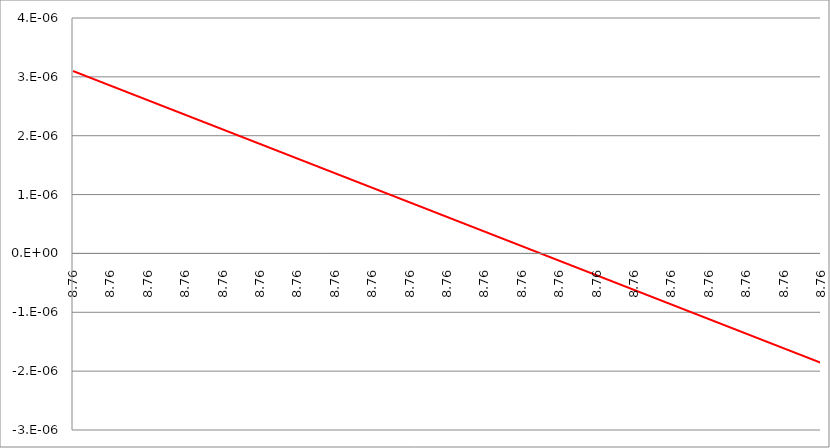
| Category | Series 1 | Series 0 | Series 2 |
|---|---|---|---|
| 8.76286429658 | 0 |  |  |
| 8.76286429658 | 0 |  |  |
| 8.762864296580004 | 0 |  |  |
| 8.762864296580005 | 0 |  |  |
| 8.762864296580007 | 0 |  |  |
| 8.762864296580007 | 0 |  |  |
| 8.76286429658001 | 0 |  |  |
| 8.76286429658001 | 0 |  |  |
| 8.762864296580014 | 0 |  |  |
| 8.762864296580016 | 0 |  |  |
| 8.762864296580018 | 0 |  |  |
| 8.76286429658002 | 0 |  |  |
| 8.76286429658002 | 0 |  |  |
| 8.762864296580023 | 0 |  |  |
| 8.762864296580023 | 0 |  |  |
| 8.762864296580027 | 0 |  |  |
| 8.762864296580029 | 0 |  |  |
| 8.76286429658003 | 0 |  |  |
| 8.76286429658003 | 0 |  |  |
| 8.762864296580034 | 0 |  |  |
| 8.762864296580036 | 0 |  |  |
| 8.762864296580037 | 0 |  |  |
| 8.76286429658004 | 0 |  |  |
| 8.76286429658004 | 0 |  |  |
| 8.76286429658004 | 0 |  |  |
| 8.762864296580045 | 0 |  |  |
| 8.762864296580046 | 0 |  |  |
| 8.762864296580046 | 0 |  |  |
| 8.76286429658005 | 0 |  |  |
| 8.76286429658005 | 0 |  |  |
| 8.762864296580053 | 0 |  |  |
| 8.762864296580055 | 0 |  |  |
| 8.762864296580055 | 0 |  |  |
| 8.762864296580059 | 0 |  |  |
| 8.76286429658006 | 0 |  |  |
| 8.76286429658006 | 0 |  |  |
| 8.762864296580062 | 0 |  |  |
| 8.762864296580066 | 0 |  |  |
| 8.762864296580068 | 0 |  |  |
| 8.76286429658007 | 0 |  |  |
| 8.76286429658007 | 0 |  |  |
| 8.762864296580071 | 0 |  |  |
| 8.762864296580075 | 0 |  |  |
| 8.762864296580076 | 0 |  |  |
| 8.762864296580078 | 0 |  |  |
| 8.76286429658008 | 0 |  |  |
| 8.76286429658008 | 0 |  |  |
| 8.762864296580084 | 0 |  |  |
| 8.762864296580085 | 0 |  |  |
| 8.762864296580087 | 0 |  |  |
| 8.762864296580087 | 0 |  |  |
| 8.76286429658009 | 0 |  |  |
| 8.76286429658009 | 0 |  |  |
| 8.762864296580094 | 0 |  |  |
| 8.762864296580094 | 0 |  |  |
| 8.762864296580098 | 0 |  |  |
| 8.7628642965801 | 0 |  |  |
| 8.7628642965801 | 0 |  |  |
| 8.762864296580103 | 0 |  |  |
| 8.762864296580103 | 0 |  |  |
| 8.762864296580107 | 0 |  |  |
| 8.762864296580108 | 0 |  |  |
| 8.76286429658011 | 0 |  |  |
| 8.76286429658011 | 0 |  |  |
| 8.762864296580114 | 0 |  |  |
| 8.762864296580116 | 0 |  |  |
| 8.762864296580117 | 0 |  |  |
| 8.76286429658012 | 0 |  |  |
| 8.76286429658012 | 0 |  |  |
| 8.762864296580123 | 0 |  |  |
| 8.762864296580124 | 0 |  |  |
| 8.762864296580126 | 0 |  |  |
| 8.762864296580126 | 0 |  |  |
| 8.76286429658013 | 0 |  |  |
| 8.76286429658013 | 0 |  |  |
| 8.762864296580133 | 0 |  |  |
| 8.762864296580135 | 0 |  |  |
| 8.762864296580137 | 0 |  |  |
| 8.762864296580139 | 0 |  |  |
| 8.76286429658014 | 0 |  |  |
| 8.76286429658014 | 0 |  |  |
| 8.762864296580142 | 0 |  |  |
| 8.762864296580146 | 0 |  |  |
| 8.762864296580148 | 0 |  |  |
| 8.76286429658015 | 0 |  |  |
| 8.76286429658015 | 0 |  |  |
| 8.762864296580153 | 0 |  |  |
| 8.762864296580155 | 0 |  |  |
| 8.762864296580156 | 0 |  |  |
| 8.762864296580158 | 0 |  |  |
| 8.76286429658016 | 0 |  |  |
| 8.76286429658016 | 0 |  |  |
| 8.762864296580164 | 0 |  |  |
| 8.762864296580165 | 0 |  |  |
| 8.762864296580165 | 0 |  |  |
| 8.762864296580169 | 0 |  |  |
| 8.76286429658017 | 0 |  |  |
| 8.762864296580172 | 0 |  |  |
| 8.762864296580174 | 0 |  |  |
| 8.762864296580174 | 0 |  |  |
| 8.762864296580178 | 0 |  |  |
| 8.76286429658018 | 0 |  |  |
| 8.76286429658018 | 0 |  |  |
| 8.762864296580181 | 0 |  |  |
| 8.762864296580185 | 0 |  |  |
| 8.762864296580187 | 0 |  |  |
| 8.762864296580188 | 0 |  |  |
| 8.76286429658019 | 0 |  |  |
| 8.76286429658019 | 0 |  |  |
| 8.762864296580194 | 0 |  |  |
| 8.762864296580196 | 0 |  |  |
| 8.762864296580197 | 0 |  |  |
| 8.762864296580197 | 0 |  |  |
| 8.7628642965802 | 0 |  |  |
| 8.7628642965802 | 0 |  |  |
| 8.762864296580204 | 0 |  |  |
| 8.762864296580206 | 0 |  |  |
| 8.762864296580206 | 0 |  |  |
| 8.76286429658021 | 0 |  |  |
| 8.76286429658021 | 0 |  |  |
| 8.76286429658021 | 0 |  |  |
| 8.762864296580213 | 0 |  |  |
| 8.762864296580217 | 0 |  |  |
| 8.762864296580219 | 0 |  |  |
| 8.76286429658022 | 0 |  |  |
| 8.76286429658022 | 0 |  |  |
| 8.762864296580222 | 0 |  |  |
| 8.762864296580226 | 0 |  |  |
| 8.762864296580227 | 0 |  |  |
| 8.76286429658023 | 0 |  |  |
| 8.76286429658023 | 0 |  |  |
| 8.76286429658023 | 0 |  |  |
| 8.762864296580235 | 0 |  |  |
| 8.762864296580236 | 0 |  |  |
| 8.762864296580238 | 0 |  |  |
| 8.76286429658024 | 0 |  |  |
| 8.76286429658024 | 0 |  |  |
| 8.76286429658024 | 0 |  |  |
| 8.762864296580245 | 0 |  |  |
| 8.762864296580245 | 0 |  |  |
| 8.762864296580249 | 0 |  |  |
| 8.76286429658025 | 0 |  |  |
| 8.76286429658025 | 0 |  |  |
| 8.762864296580254 | 0 |  |  |
| 8.762864296580254 | 0 |  |  |
| 8.762864296580258 | 0 |  |  |
| 8.76286429658026 | 0 |  |  |
| 8.76286429658026 | 0 |  |  |
| 8.76286429658026 | 0 |  |  |
| 8.762864296580265 | 0 |  |  |
| 8.762864296580267 | 0 |  |  |
| 8.762864296580268 | 0 |  |  |
| 8.76286429658027 | 0 |  |  |
| 8.76286429658027 | 0 |  |  |
| 8.762864296580274 | 0 |  |  |
| 8.762864296580275 | 0 |  |  |
| 8.762864296580277 | 0 |  |  |
| 8.762864296580277 | 0 |  |  |
| 8.76286429658028 | 0 |  |  |
| 8.76286429658028 | 0 |  |  |
| 8.762864296580284 | 0 |  |  |
| 8.762864296580286 | 0 |  |  |
| 8.762864296580288 | 0 |  |  |
| 8.76286429658029 | 0 |  |  |
| 8.76286429658029 | 0 |  |  |
| 8.76286429658029 | 0 |  |  |
| 8.762864296580293 | 0 |  |  |
| 8.762864296580297 | 0 |  |  |
| 8.762864296580299 | 0 |  |  |
| 8.7628642965803 | 0 |  |  |
| 8.7628642965803 | 0 |  |  |
| 8.762864296580304 | 0 |  |  |
| 8.762864296580306 | 0 |  |  |
| 8.762864296580307 | 0 |  |  |
| 8.76286429658031 | 0 |  |  |
| 8.76286429658031 | 0 |  |  |
| 8.76286429658031 | 0 |  |  |
| 8.762864296580315 | 0 |  |  |
| 8.762864296580316 | 0 |  |  |
| 8.762864296580316 | 0 |  |  |
| 8.76286429658032 | 0 |  |  |
| 8.76286429658032 | 0 |  |  |
| 8.762864296580323 | 0 |  |  |
| 8.762864296580325 | 0 |  |  |
| 8.762864296580325 | 0 |  |  |
| 8.762864296580329 | 0 |  |  |
| 8.76286429658033 | 0 |  |  |
| 8.76286429658033 | 0 |  |  |
| 8.762864296580332 | 0 |  |  |
| 8.762864296580336 | 0 |  |  |
| 8.762864296580338 | 0 |  |  |
| 8.76286429658034 | 0 |  |  |
| 8.76286429658034 | 0 |  |  |
| 8.76286429658034 | 0 |  |  |
| 8.762864296580345 | 0 |  |  |
| 8.762864296580346 | 0 |  |  |
| 8.762864296580348 | 0 |  |  |
| 8.76286429658035 | 0 |  |  |
| 8.76286429658035 | 0 |  |  |
| 8.762864296580354 | 0 |  |  |
| 8.762864296580355 | 0 |  |  |
| 8.762864296580357 | 0 |  |  |
| 8.762864296580357 | 0 |  |  |
| 8.76286429658036 | 0 |  |  |
| 8.76286429658036 | 0 |  |  |
| 8.762864296580364 | 0 |  |  |
| 8.762864296580364 | 0 |  |  |
| 8.762864296580368 | 0 |  |  |
| 8.76286429658037 | 0 |  |  |
| 8.76286429658037 | 0 |  |  |
| 8.762864296580373 | 0 |  |  |
| 8.762864296580373 | 0 |  |  |
| 8.762864296580377 | 0 |  |  |
| 8.762864296580378 | 0 |  |  |
| 8.76286429658038 | 0 |  |  |
| 8.76286429658038 | 0 |  |  |
| 8.762864296580384 | 0 |  |  |
| 8.762864296580386 | 0 |  |  |
| 8.762864296580387 | 0 |  |  |
| 8.76286429658039 | 0 |  |  |
| 8.76286429658039 | 0 |  |  |
| 8.76286429658039 | 0 |  |  |
| 8.762864296580394 | 0 |  |  |
| 8.762864296580396 | 0 |  |  |
| 8.762864296580396 | 0 |  |  |
| 8.7628642965804 | 0 |  |  |
| 8.7628642965804 | 0 |  |  |
| 8.762864296580403 | 0 |  |  |
| 8.762864296580405 | 0 |  |  |
| 8.762864296580407 | 0 |  |  |
| 8.762864296580409 | 0 |  |  |
| 8.76286429658041 | 0 |  |  |
| 8.76286429658041 | 0 |  |  |
| 8.762864296580412 | 0 |  |  |
| 8.762864296580416 | 0 |  |  |
| 8.762864296580418 | 0 |  |  |
| 8.76286429658042 | 0 |  |  |
| 8.76286429658042 | 0 |  |  |
| 8.762864296580423 | 0 |  |  |
| 8.762864296580425 | 0 |  |  |
| 8.762864296580426 | 0 |  |  |
| 8.762864296580428 | 0 |  |  |
| 8.76286429658043 | 0 |  |  |
| 8.76286429658043 | 0 |  |  |
| 8.762864296580434 | 0 |  |  |
| 8.762864296580435 | 0 |  |  |
| 8.762864296580437 | 0 |  |  |
| 8.762864296580439 | 0 |  |  |
| 8.76286429658044 | 0 |  |  |
| 8.76286429658044 | 0 |  |  |
| 8.762864296580444 | 0 |  |  |
| 8.762864296580444 | 0 |  |  |
| 8.762864296580448 | 0 |  |  |
| 8.76286429658045 | 0 |  |  |
| 8.76286429658045 | 0 |  |  |
| 8.762864296580451 | 0 |  |  |
| 8.762864296580455 | 0 |  |  |
| 8.762864296580457 | 0 |  |  |
| 8.762864296580458 | 0 |  |  |
| 8.76286429658046 | 0 |  |  |
| 8.76286429658046 | 0 |  |  |
| 8.762864296580464 | 0 |  |  |
| 8.762864296580466 | 0 |  |  |
| 8.762864296580467 | 0 |  |  |
| 8.762864296580467 | 0 |  |  |
| 8.76286429658047 | 0 |  |  |
| 8.762864296580473 | 0 |  |  |
| 8.762864296580474 | 0 |  |  |
| 8.762864296580476 | 0 |  |  |
| 8.762864296580476 | 0 |  |  |
| 8.76286429658048 | 0 |  |  |
| 8.76286429658048 | 0 |  |  |
| 8.762864296580483 | 0 |  |  |
| 8.762864296580483 | 0 |  |  |
| 8.762864296580487 | 0 |  |  |
| 8.762864296580489 | 0 |  |  |
| 8.76286429658049 | 0 |  |  |
| 8.76286429658049 | 0 |  |  |
| 8.762864296580492 | 0 |  |  |
| 8.762864296580496 | 0 |  |  |
| 8.762864296580497 | 0 |  |  |
| 8.7628642965805 | 0 |  |  |
| 8.7628642965805 | 0 |  |  |
| 8.762864296580503 | 0 |  |  |
| 8.762864296580505 | 0 |  |  |
| 8.762864296580506 | 0 |  |  |
| 8.762864296580508 | 0 |  |  |
| 8.76286429658051 | 0 |  |  |
| 8.76286429658051 | 0 |  |  |
| 8.762864296580513 | 0 |  |  |
| 8.762864296580515 | 0 |  |  |
| 8.762864296580515 | 0 |  |  |
| 8.762864296580519 | 0 |  |  |
| 8.76286429658052 | 0 |  |  |
| 8.762864296580522 | 0 |  |  |
| 8.762864296580524 | 0 |  |  |
| 8.762864296580524 | 0 |  |  |
| 8.762864296580528 | 0 |  |  |
| 8.76286429658053 | 0 |  |  |
| 8.76286429658053 | 0 |  |  |
| 8.762864296580531 | 0 |  |  |
| 8.762864296580535 | 0 |  |  |
| 8.762864296580537 | 0 |  |  |
| 8.762864296580538 | 0 |  |  |
| 8.76286429658054 | 0 |  |  |
| 8.76286429658054 | 0 |  |  |
| 8.762864296580544 | 0 |  |  |
| 8.762864296580545 | 0 |  |  |
| 8.762864296580547 | 0 |  |  |
| 8.762864296580547 | 0 |  |  |
| 8.76286429658055 | 0 |  |  |
| 8.762864296580553 | 0 |  |  |
| 8.762864296580554 | 0 |  |  |
| 8.762864296580556 | 0 |  |  |
| 8.762864296580558 | 0 |  |  |
| 8.76286429658056 | 0 |  |  |
| 8.76286429658056 | 0 |  |  |
| 8.762864296580563 | 0 |  |  |
| 8.762864296580563 | 0 |  |  |
| 8.762864296580567 | 0 |  |  |
| 8.762864296580569 | 0 |  |  |
| 8.76286429658057 | 0 |  |  |
| 8.762864296580572 | 0 |  |  |
| 8.762864296580574 | 0 |  |  |
| 8.762864296580576 | 0 |  |  |
| 8.762864296580577 | 0 |  |  |
| 8.76286429658058 | 0 |  |  |
| 8.76286429658058 | 0 |  |  |
| 8.762864296580583 | 0 |  |  |
| 8.762864296580585 | 0 |  |  |
| 8.762864296580586 | 0 |  |  |
| 8.762864296580586 | 0 |  |  |
| 8.76286429658059 | 0 |  |  |
| 8.76286429658059 | 0 |  |  |
| 8.762864296580593 | 0 |  |  |
| 8.762864296580595 | 0 |  |  |
| 8.762864296580595 | 0 |  |  |
| 8.762864296580599 | 0 |  |  |
| 8.7628642965806 | 0 |  |  |
| 8.7628642965806 | 0 |  |  |
| 8.762864296580602 | 0 |  |  |
| 8.762864296580606 | 0 |  |  |
| 8.762864296580608 | 0 |  |  |
| 8.76286429658061 | 0 |  |  |
| 8.76286429658061 | 0 |  |  |
| 8.76286429658061 | 0 |  |  |
| 8.762864296580615 | 0 |  |  |
| 8.762864296580616 | 0 |  |  |
| 8.762864296580618 | 0 |  |  |
| 8.76286429658062 | 0 |  |  |
| 8.76286429658062 | 0 |  |  |
| 8.762864296580624 | 0 |  |  |
| 8.762864296580625 | 0 |  |  |
| 8.762864296580627 | 0 |  |  |
| 8.762864296580627 | 0 |  |  |
| 8.76286429658063 | 0 |  |  |
| 8.76286429658063 | 0 |  |  |
| 8.762864296580634 | 0 |  |  |
| 8.762864296580634 | 0 |  |  |
| 8.762864296580638 | 0 |  |  |
| 8.76286429658064 | 0 |  |  |
| 8.76286429658064 | 0 |  |  |
| 8.76286429658064 | 0 |  |  |
| 8.762864296580643 | 0 |  |  |
| 8.762864296580647 | 0 |  |  |
| 8.762864296580648 | 0 |  |  |
| 8.76286429658065 | 0 |  |  |
| 8.76286429658065 | 0 |  |  |
| 8.762864296580654 | 0 |  |  |
| 8.762864296580656 | 0 |  |  |
| 8.762864296580657 | 0 |  |  |
| 8.76286429658066 | 0 |  |  |
| 8.76286429658066 | 0 |  |  |
| 8.76286429658066 | 0 |  |  |
| 8.762864296580664 | 0 |  |  |
| 8.762864296580666 | 0 |  |  |
| 8.762864296580666 | 0 |  |  |
| 8.76286429658067 | 0 |  |  |
| 8.76286429658067 | 0 |  |  |
| 8.762864296580673 | 0 |  |  |
| 8.762864296580675 | 0 |  |  |
| 8.762864296580675 | 0 |  |  |
| 8.762864296580679 | 0 |  |  |
| 8.76286429658068 | 0 |  |  |
| 8.76286429658068 | 0 |  |  |
| 8.762864296580682 | 0 |  |  |
| 8.762864296580686 | 0 |  |  |
| 8.762864296580688 | 0 |  |  |
| 8.76286429658069 | 0 |  |  |
| 8.76286429658069 | 0 |  |  |
| 8.76286429658069 | 0 |  |  |
| 8.762864296580695 | 0 |  |  |
| 8.762864296580696 | 0 |  |  |
| 8.762864296580698 | 0 |  |  |
| 8.7628642965807 | 0 |  |  |
| 8.7628642965807 | 0 |  |  |
| 8.762864296580704 | 0 |  |  |
| 8.762864296580705 | 0 |  |  |
| 8.762864296580707 | 0 |  |  |
| 8.762864296580709 | 0 |  |  |
| 8.76286429658071 | 0 |  |  |
| 8.76286429658071 | 0 |  |  |
| 8.762864296580714 | 0 |  |  |
| 8.762864296580714 | 0 |  |  |
| 8.762864296580718 | 0 |  |  |
| 8.76286429658072 | 0 |  |  |
| 8.76286429658072 | 0 |  |  |
| 8.762864296580721 | 0 |  |  |
| 8.762864296580725 | 0 |  |  |
| 8.762864296580727 | 0 |  |  |
| 8.762864296580728 | 0 |  |  |
| 8.76286429658073 | 0 |  |  |
| 8.76286429658073 | 0 |  |  |
| 8.762864296580734 | 0 |  |  |
| 8.762864296580736 | 0 |  |  |
| 8.762864296580737 | 0 |  |  |
| 8.762864296580737 | 0 |  |  |
| 8.76286429658074 | 0 |  |  |
| 8.76286429658074 | 0 |  |  |
| 8.762864296580744 | 0 |  |  |
| 8.762864296580746 | 0 |  |  |
| 8.762864296580746 | 0 |  |  |
| 8.76286429658075 | 0 |  |  |
| 8.76286429658075 | 0 |  |  |
| 8.762864296580753 | 0 |  |  |
| 8.762864296580753 | 0 |  |  |
| 8.762864296580757 | 0 |  |  |
| 8.762864296580759 | 0 |  |  |
| 8.76286429658076 | 0 |  |  |
| 8.76286429658076 | 0 |  |  |
| 8.762864296580762 | 0 |  |  |
| 8.762864296580766 | 0 |  |  |
| 8.762864296580767 | 0 |  |  |
| 8.76286429658077 | 0 |  |  |
| 8.76286429658077 | 0 |  |  |
| 8.762864296580773 | 0 |  |  |
| 8.762864296580775 | 0 |  |  |
| 8.762864296580776 | 0 |  |  |
| 8.762864296580778 | 0 |  |  |
| 8.76286429658078 | 0 |  |  |
| 8.76286429658078 | 0 |  |  |
| 8.762864296580783 | 0 |  |  |
| 8.762864296580785 | 0 |  |  |
| 8.762864296580785 | 0 |  |  |
| 8.762864296580789 | 0 |  |  |
| 8.76286429658079 | 0 |  |  |
| 8.76286429658079 | 0 |  |  |
| 8.762864296580794 | 0 |  |  |
| 8.762864296580794 | 0 |  |  |
| 8.762864296580798 | 0 |  |  |
| 8.7628642965808 | 0 |  |  |
| 8.7628642965808 | 0 |  |  |
| 8.762864296580801 | 0 |  |  |
| 8.762864296580805 | 0 |  |  |
| 8.762864296580807 | 0 |  |  |
| 8.762864296580808 | 0 |  |  |
| 8.76286429658081 | 0 |  |  |
| 8.76286429658081 | 0 |  |  |
| 8.762864296580814 | 0 |  |  |
| 8.762864296580815 | 0 |  |  |
| 8.762864296580817 | 0 |  |  |
| 8.762864296580817 | 0 |  |  |
| 8.76286429658082 | 0 |  |  |
| 8.762864296580823 | 0 |  |  |
| 8.762864296580824 | 0 |  |  |
| 8.762864296580826 | 0 |  |  |
| 8.762864296580828 | 0 |  |  |
| 8.76286429658083 | 0 |  |  |
| 8.76286429658083 | 0 |  |  |
| 8.762864296580833 | 0 |  |  |
| 8.762864296580833 | 0 |  |  |
| 8.762864296580837 | 0 |  |  |
| 8.762864296580839 | 0 |  |  |
| 8.76286429658084 | 0 |  |  |
| 8.76286429658084 | 0 |  |  |
| 8.762864296580844 | 0 |  |  |
| 8.762864296580846 | 0 |  |  |
| 8.762864296580847 | 0 |  |  |
| 8.76286429658085 | 0 |  |  |
| 8.76286429658085 | 0 |  |  |
| 8.762864296580853 | 0 |  |  |
| 8.762864296580855 | 0 |  |  |
| 8.762864296580856 | 0 |  |  |
| 8.762864296580858 | 0 |  |  |
| 8.76286429658086 | 0 |  |  |
| 8.76286429658086 | 0 |  |  |
| 8.762864296580863 | 0 |  |  |
| 8.762864296580865 | 0 |  |  |
| 8.762864296580865 | 0 |  |  |
| 8.762864296580869 | 0 |  |  |
| 8.76286429658087 | 0 |  |  |
| 8.762864296580872 | 0 |  |  |
| 8.762864296580872 | 0 |  |  |
| 8.762864296580876 | 0 |  |  |
| 8.762864296580878 | 0 |  |  |
| 8.76286429658088 | 0 |  |  |
| 8.76286429658088 | 0 |  |  |
| 8.762864296580881 | 0 |  |  |
| 8.762864296580885 | 0 |  |  |
| 8.762864296580887 | 0 |  |  |
| 8.762864296580888 | 0 |  |  |
| 8.76286429658089 | 0 |  |  |
| 8.76286429658089 | 0 |  |  |
| 8.762864296580894 | 0 |  |  |
| 8.762864296580895 | 0 |  |  |
| 8.762864296580897 | 0 |  |  |
| 8.762864296580897 | 0 |  |  |
| 8.7628642965809 | 0 |  |  |
| 8.7628642965809 | 0 |  |  |
| 8.762864296580904 | 0 |  |  |
| 8.762864296580904 | 0 |  |  |
| 8.762864296580908 | 0 |  |  |
| 8.76286429658091 | 0 |  |  |
| 8.76286429658091 | 0 |  |  |
| 8.76286429658091 | 0 |  |  |
| 8.762864296580913 | 0 |  |  |
| 8.762864296580917 | 0 |  |  |
| 8.762864296580918 | 0 |  |  |
| 8.76286429658092 | 0 |  |  |
| 8.76286429658092 | 0 |  |  |
| 8.762864296580924 | 0 |  |  |
| 8.762864296580926 | 0 |  |  |
| 8.762864296580927 | 0 |  |  |
| 8.76286429658093 | 0 |  |  |
| 8.76286429658093 | 0 |  |  |
| 8.76286429658093 | 0 |  |  |
| 8.762864296580934 | 0 |  |  |
| 8.762864296580936 | 0 |  |  |
| 8.762864296580936 | 0 |  |  |
| 8.76286429658094 | 0 |  |  |
| 8.76286429658094 | 0 |  |  |
| 8.76286429658094 | 0 |  |  |
| 8.762864296580945 | 0 |  |  |
| 8.762864296580945 | 0 |  |  |
| 8.762864296580949 | 0 |  |  |
| 8.76286429658095 | 0 |  |  |
| 8.76286429658095 | 0 |  |  |
| 8.762864296580952 | 0 |  |  |
| 8.762864296580956 | 0 |  |  |
| 8.762864296580958 | 0 |  |  |
| 8.76286429658096 | 0 |  |  |
| 8.76286429658096 | 0 |  |  |
| 8.76286429658096 | 0 |  |  |
| 8.762864296580965 | 0 |  |  |
| 8.762864296580966 | 0 |  |  |
| 8.762864296580968 | 0 |  |  |
| 8.76286429658097 | 0 |  |  |
| 8.76286429658097 | 0 |  |  |
| 8.762864296580974 | 0 |  |  |
| 8.762864296580975 | 0 |  |  |
| 8.762864296580977 | 0 |  |  |
| 8.762864296580979 | 0 |  |  |
| 8.76286429658098 | 0 |  |  |
| 8.76286429658098 | 0 |  |  |
| 8.762864296580984 | 0 |  |  |
| 8.762864296580984 | 0 |  |  |
| 8.762864296580988 | 0 |  |  |
| 8.76286429658099 | 0 |  |  |
| 8.76286429658099 | 0 |  |  |
| 8.76286429658099 | 0 |  |  |
| 8.762864296580995 | 0 |  |  |
| 8.762864296580997 | 0 |  |  |
| 8.762864296580998 | 0 |  |  |
| 8.762864296581 | 0 |  |  |
| 8.762864296581 | 0 |  |  |
| 8.762864296581004 | 0 |  |  |
| 8.762864296581006 | 0 |  |  |
| 8.762864296581007 | 0 |  |  |
| 8.762864296581007 | 0 |  |  |
| 8.76286429658101 | 0 |  |  |
| 8.76286429658101 | 0 |  |  |
| 8.762864296581014 | 0 |  |  |
| 8.762864296581016 | 0 |  |  |
| 8.762864296581016 | 0 |  |  |
| 8.76286429658102 | 0 |  |  |
| 8.76286429658102 | 0 |  |  |
| 8.762864296581023 | 0 |  |  |
| 8.762864296581023 | 0 |  |  |
| 8.762864296581027 | 0 |  |  |
| 8.762864296581029 | 0 |  |  |
| 8.76286429658103 | 0 |  |  |
| 8.76286429658103 | 0 |  |  |
| 8.762864296581032 | 0 |  |  |
| 8.762864296581036 | 0 |  |  |
| 8.762864296581037 | 0 |  |  |
| 8.76286429658104 | 0 |  |  |
| 8.76286429658104 | 0 |  |  |
| 8.76286429658104 | 0 |  |  |
| 8.762864296581045 | 0 |  |  |
| 8.762864296581046 | 0 |  |  |
| 8.762864296581048 | 0 |  |  |
| 8.76286429658105 | 0 |  |  |
| 8.76286429658105 | 0 |  |  |
| 8.762864296581053 | 0 |  |  |
| 8.762864296581055 | 0 |  |  |
| 8.762864296581055 | 0 |  |  |
| 8.762864296581059 | 0 |  |  |
| 8.76286429658106 | 0 |  |  |
| 8.76286429658106 | 0 |  |  |
| 8.762864296581064 | 0 |  |  |
| 8.762864296581064 | 0 |  |  |
| 8.762864296581068 | 0 |  |  |
| 8.76286429658107 | 0 |  |  |
| 8.76286429658107 | 0 |  |  |
| 8.762864296581071 | 0 |  |  |
| 8.762864296581075 | 0 |  |  |
| 8.762864296581077 | 0 |  |  |
| 8.762864296581078 | 0 |  |  |
| 8.76286429658108 | 0 |  |  |
| 8.76286429658108 | 0 |  |  |
| 8.762864296581084 | 0 |  |  |
| 8.762864296581085 | 0 |  |  |
| 8.762864296581087 | 0 |  |  |
| 8.762864296581087 | 0 |  |  |
| 8.76286429658109 | 0 |  |  |
| 8.76286429658109 | 0 |  |  |
| 8.762864296581094 | 0 |  |  |
| 8.762864296581096 | 0 |  |  |
| 8.762864296581096 | 0 |  |  |
| 8.7628642965811 | 0 |  |  |
| 8.7628642965811 | 0 |  |  |
| 8.762864296581103 | 0 |  |  |
| 8.762864296581103 | 0 |  |  |
| 8.762864296581107 | 0 |  |  |
| 8.762864296581109 | 0 |  |  |
| 8.76286429658111 | 0 |  |  |
| 8.76286429658111 | 0 |  |  |
| 8.762864296581114 | 0 |  |  |
| 8.762864296581116 | 0 |  |  |
| 8.762864296581117 | 0 |  |  |
| 8.76286429658112 | 0 |  |  |
| 8.76286429658112 | 0 |  |  |
| 8.762864296581123 | 0 |  |  |
| 8.762864296581125 | 0 |  |  |
| 8.762864296581126 | 0 |  |  |
| 8.762864296581128 | 0 |  |  |
| 8.76286429658113 | 0 |  |  |
| 8.76286429658113 | 0 |  |  |
| 8.762864296581133 | 0 |  |  |
| 8.762864296581135 | 0 |  |  |
| 8.762864296581135 | 0 |  |  |
| 8.762864296581139 | 0 |  |  |
| 8.76286429658114 | 0 |  |  |
| 8.76286429658114 | 0 |  |  |
| 8.762864296581142 | 0 |  |  |
| 8.762864296581146 | 0 |  |  |
| 8.762864296581148 | 0 |  |  |
| 8.76286429658115 | 0 |  |  |
| 8.76286429658115 | 0 |  |  |
| 8.762864296581151 | 0 |  |  |
| 8.762864296581155 | 0 |  |  |
| 8.762864296581157 | 0 |  |  |
| 8.762864296581158 | 0 |  |  |
| 8.76286429658116 | 0 |  |  |
| 8.76286429658116 | 0 |  |  |
| 8.762864296581164 | 0 |  |  |
| 8.762864296581165 | 0 |  |  |
| 8.762864296581167 | 0 |  |  |
| 8.762864296581167 | 0 |  |  |
| 8.76286429658117 | 0 |  |  |
| 8.762864296581172 | 0 |  |  |
| 8.762864296581174 | 0 |  |  |
| 8.762864296581174 | 0 |  |  |
| 8.762864296581178 | 0 |  |  |
| 8.76286429658118 | 0 |  |  |
| 8.76286429658118 | 0 |  |  |
| 8.762864296581183 | 0 |  |  |
| 8.762864296581183 | 0 |  |  |
| 8.762864296581187 | 0 |  |  |
| 8.762864296581188 | 0 |  |  |
| 8.76286429658119 | 0 |  |  |
| 8.76286429658119 | 0 |  |  |
| 8.762864296581194 | 0 |  |  |
| 8.762864296581196 | 0 |  |  |
| 8.762864296581197 | 0 |  |  |
| 8.7628642965812 | 0 |  |  |
| 8.7628642965812 | 0 |  |  |
| 8.7628642965812 | 0 |  |  |
| 8.762864296581204 | 0 |  |  |
| 8.762864296581206 | 0 |  |  |
| 8.762864296581206 | 0 |  |  |
| 8.76286429658121 | 0 |  |  |
| 8.76286429658121 | 0 |  |  |
| 8.76286429658121 | 0 |  |  |
| 8.762864296581215 | 0 |  |  |
| 8.762864296581215 | 0 |  |  |
| 8.762864296581219 | 0 |  |  |
| 8.76286429658122 | 0 |  |  |
| 8.76286429658122 | 0 |  |  |
| 8.762864296581222 | 0 |  |  |
| 8.762864296581226 | 0 |  |  |
| 8.762864296581228 | 0 |  |  |
| 8.76286429658123 | 0 |  |  |
| 8.76286429658123 | 0 |  |  |
| 8.76286429658123 | 0 |  |  |
| 8.762864296581235 | 0 |  |  |
| 8.762864296581236 | 0 |  |  |
| 8.762864296581238 | 0 |  |  |
| 8.76286429658124 | 0 |  |  |
| 8.76286429658124 | 0 |  |  |
| 8.76286429658124 | 0 |  |  |
| 8.762864296581245 | 0 |  |  |
| 8.762864296581247 | 0 |  |  |
| 8.762864296581249 | 0 |  |  |
| 8.76286429658125 | 0 |  |  |
| 8.76286429658125 | 0 |  |  |
| 8.762864296581254 | 0 |  |  |
| 8.762864296581254 | 0 |  |  |
| 8.762864296581258 | 0 |  |  |
| 8.76286429658126 | 0 |  |  |
| 8.76286429658126 | 0 |  |  |
| 8.76286429658126 | 0 |  |  |
| 8.762864296581265 | 0 |  |  |
| 8.762864296581267 | 0 |  |  |
| 8.762864296581268 | 0 |  |  |
| 8.76286429658127 | 0 |  |  |
| 8.76286429658127 | 0 |  |  |
| 8.762864296581274 | 0 |  |  |
| 8.762864296581276 | 0 |  |  |
| 8.762864296581277 | 0 |  |  |
| 8.762864296581277 | 0 |  |  |
| 8.76286429658128 | 0 |  |  |
| 8.76286429658128 | 0 |  |  |
| 8.762864296581284 | 0 |  |  |
| 8.762864296581286 | 0 |  |  |
| 8.762864296581286 | 0 |  |  |
| 8.76286429658129 | 0 |  |  |
| 8.76286429658129 | 0 |  |  |
| 8.76286429658129 | 0 |  |  |
| 8.762864296581293 | 0 |  |  |
| 8.762864296581297 | 0 |  |  |
| 8.762864296581299 | 0 |  |  |
| 8.7628642965813 | 0 |  |  |
| 8.7628642965813 | 0 |  |  |
| 8.762864296581302 | 0 |  |  |
| 8.762864296581306 | 0 |  |  |
| 8.762864296581307 | 0 |  |  |
| 8.76286429658131 | 0 |  |  |
| 8.76286429658131 | 0 |  |  |
| 8.76286429658131 | 0 |  |  |
| 8.762864296581315 | 0 |  |  |
| 8.762864296581316 | 0 |  |  |
| 8.762864296581318 | 0 |  |  |
| 8.76286429658132 | 0 |  |  |
| 8.76286429658132 | 0 |  |  |
| 8.762864296581323 | 0 |  |  |
| 8.762864296581325 | 0 |  |  |
| 8.762864296581325 | 0 |  |  |
| 8.762864296581329 | 0 |  |  |
| 8.76286429658133 | 0 |  |  |
| 8.76286429658133 | 0 |  |  |
| 8.762864296581334 | 0 |  |  |
| 8.762864296581334 | 0 |  |  |
| 8.762864296581338 | 0 |  |  |
| 8.76286429658134 | 0 |  |  |
| 8.76286429658134 | 0 |  |  |
| 8.76286429658134 | 0 |  |  |
| 8.762864296581345 | 0 |  |  |
| 8.762864296581347 | 0 |  |  |
| 8.762864296581348 | 0 |  |  |
| 8.76286429658135 | 0 |  |  |
| 8.76286429658135 | 0 |  |  |
| 8.762864296581354 | 0 |  |  |
| 8.762864296581355 | 0 |  |  |
| 8.762864296581357 | 0 |  |  |
| 8.762864296581357 | 0 |  |  |
| 8.76286429658136 | 0 |  |  |
| 8.76286429658136 | 0 |  |  |
| 8.762864296581364 | 0 |  |  |
| 8.762864296581366 | 0 |  |  |
| 8.762864296581366 | 0 |  |  |
| 8.76286429658137 | 0 |  |  |
| 8.76286429658137 | 0 |  |  |
| 8.762864296581373 | 0 |  |  |
| 8.762864296581373 | 0 |  |  |
| 8.762864296581377 | 0 |  |  |
| 8.762864296581379 | 0 |  |  |
| 8.76286429658138 | 0 |  |  |
| 8.76286429658138 | 0 |  |  |
| 8.762864296581384 | 0 |  |  |
| 8.762864296581386 | 0 |  |  |
| 8.762864296581387 | 0 |  |  |
| 8.76286429658139 | 0 |  |  |
| 8.76286429658139 | 0 |  |  |
| 8.76286429658139 | 0 |  |  |
| 8.762864296581395 | 0 |  |  |
| 8.762864296581396 | 0 |  |  |
| 8.762864296581398 | 0 |  |  |
| 8.7628642965814 | 0 |  |  |
| 8.7628642965814 | 0 |  |  |
| 8.762864296581403 | 0 |  |  |
| 8.762864296581405 | 0 |  |  |
| 8.762864296581405 | 0 |  |  |
| 8.762864296581409 | 0 |  |  |
| 8.76286429658141 | 0 |  |  |
| 8.76286429658141 | 0 |  |  |
| 8.762864296581414 | 0 |  |  |
| 8.762864296581416 | 0 |  |  |
| 8.762864296581418 | 0 |  |  |
| 8.76286429658142 | 0 |  |  |
| 8.76286429658142 | 0 |  |  |
| 8.762864296581421 | 0 |  |  |
| 8.762864296581425 | 0 |  |  |
| 8.762864296581427 | 0 |  |  |
| 8.762864296581428 | 0 |  |  |
| 8.76286429658143 | 0 |  |  |
| 8.76286429658143 | 0 |  |  |
| 8.762864296581434 | 0 |  |  |
| 8.762864296581435 | 0 |  |  |
| 8.762864296581437 | 0 |  |  |
| 8.762864296581437 | 0 |  |  |
| 8.76286429658144 | 0 |  |  |
| 8.76286429658144 | 0 |  |  |
| 8.762864296581444 | 0 |  |  |
| 8.762864296581444 | 0 |  |  |
| 8.762864296581448 | 0 |  |  |
| 8.76286429658145 | 0 |  |  |
| 8.76286429658145 | 0 |  |  |
| 8.762864296581453 | 0 |  |  |
| 8.762864296581453 | 0 |  |  |
| 8.762864296581457 | 0 |  |  |
| 8.762864296581458 | 0 |  |  |
| 8.76286429658146 | 0 |  |  |
| 8.76286429658146 | 0 |  |  |
| 8.762864296581464 | 0 |  |  |
| 8.762864296581466 | 0 |  |  |
| 8.762864296581467 | 0 |  |  |
| 8.76286429658147 | 0 |  |  |
| 8.76286429658147 | 0 |  |  |
| 8.762864296581473 | 0 |  |  |
| 8.762864296581474 | 0 |  |  |
| 8.762864296581476 | 0 |  |  |
| 8.762864296581476 | 0 |  |  |
| 8.76286429658148 | 0 |  |  |
| 8.76286429658148 | 0 |  |  |
| 8.762864296581483 | 0 |  |  |
| 8.762864296581485 | 0 |  |  |
| 8.762864296581485 | 0 |  |  |
| 8.762864296581489 | 0 |  |  |
| 8.76286429658149 | 0 |  |  |
| 8.76286429658149 | 0 |  |  |
| 8.762864296581492 | 0 |  |  |
| 8.762864296581496 | 0 |  |  |
| 8.762864296581498 | 0 |  |  |
| 8.7628642965815 | 0 |  |  |
| 8.7628642965815 | 0 |  |  |
| 8.762864296581501 | 0 |  |  |
| 8.762864296581505 | 0 |  |  |
| 8.762864296581506 | 0 |  |  |
| 8.762864296581508 | 0 |  |  |
| 8.76286429658151 | 0 |  |  |
| 8.76286429658151 | 0 |  |  |
| 8.762864296581514 | 0 |  |  |
| 8.762864296581515 | 0 |  |  |
| 8.762864296581517 | 0 |  |  |
| 8.762864296581519 | 0 |  |  |
| 8.76286429658152 | 0 |  |  |
| 8.762864296581522 | 0 |  |  |
| 8.762864296581524 | 0 |  |  |
| 8.762864296581524 | 0 |  |  |
| 8.762864296581528 | 0 |  |  |
| 8.76286429658153 | 0 |  |  |
| 8.76286429658153 | 0 |  |  |
| 8.762864296581533 | 0 |  |  |
| 8.762864296581535 | 0 |  |  |
| 8.762864296581537 | 0 |  |  |
| 8.762864296581538 | 0 |  |  |
| 8.76286429658154 | 0 |  |  |
| 8.76286429658154 | 0 |  |  |
| 8.762864296581544 | 0 |  |  |
| 8.762864296581546 | 0 |  |  |
| 8.762864296581547 | 0 |  |  |
| 8.76286429658155 | 0 |  |  |
| 8.76286429658155 | 0 |  |  |
| 8.762864296581553 | 0 |  |  |
| 8.762864296581554 | 0 |  |  |
| 8.762864296581556 | 0 |  |  |
| 8.762864296581556 | 0 |  |  |
| 8.76286429658156 | 0 |  |  |
| 8.76286429658156 | 0 |  |  |
| 8.762864296581563 | 0 |  |  |
| 8.762864296581563 | 0 |  |  |
| 8.762864296581567 | 0 |  |  |
| 8.762864296581569 | 0 |  |  |
| 8.76286429658157 | 0 |  |  |
| 8.762864296581572 | 0 |  |  |
| 8.762864296581572 | 0 |  |  |
| 8.762864296581576 | 0 |  |  |
| 8.762864296581578 | 0 |  |  |
| 8.76286429658158 | 0 |  |  |
| 8.76286429658158 | 0 |  |  |
| 8.762864296581583 | 0 |  |  |
| 8.762864296581585 | 0 |  |  |
| 8.762864296581586 | 0 |  |  |
| 8.762864296581588 | 0 |  |  |
| 8.76286429658159 | 0 |  |  |
| 8.76286429658159 | 0 |  |  |
| 8.762864296581593 | 0 |  |  |
| 8.762864296581595 | 0 |  |  |
| 8.762864296581595 | 0 |  |  |
| 8.762864296581599 | 0 |  |  |
| 8.7628642965816 | 0 |  |  |
| 8.7628642965816 | 0 |  |  |
| 8.762864296581604 | 0 |  |  |
| 8.762864296581604 | 0 |  |  |
| 8.762864296581608 | 0 |  |  |
| 8.76286429658161 | 0 |  |  |
| 8.76286429658161 | 0 |  |  |
| 8.76286429658161 | 0 |  |  |
| 8.762864296581615 | 0 |  |  |
| 8.762864296581617 | 0 |  |  |
| 8.762864296581618 | 0 |  |  |
| 8.76286429658162 | 0 |  |  |
| 8.76286429658162 | 0 |  |  |
| 8.762864296581624 | 0 |  |  |
| 8.762864296581625 | 0 |  |  |
| 8.762864296581627 | 0 |  |  |
| 8.762864296581627 | 0 |  |  |
| 8.76286429658163 | 0 |  |  |
| 8.76286429658163 | 0 |  |  |
| 8.762864296581634 | 0 |  |  |
| 8.762864296581636 | 0 |  |  |
| 8.762864296581636 | 0 |  |  |
| 8.76286429658164 | 0 |  |  |
| 8.76286429658164 | 0 |  |  |
| 8.76286429658164 | 0 |  |  |
| 8.762864296581643 | 0 |  |  |
| 8.762864296581647 | 0 |  |  |
| 8.762864296581649 | 0 |  |  |
| 8.76286429658165 | 0 |  |  |
| 8.76286429658165 | 0 |  |  |
| 8.762864296581652 | 0 |  |  |
| 8.762864296581656 | 0 |  |  |
| 8.762864296581657 | 0 |  |  |
| 8.76286429658166 | 0 |  |  |
| 8.76286429658166 | 0 |  |  |
| 8.76286429658166 | 0 |  |  |
| 8.762864296581665 | 0 |  |  |
| 8.762864296581666 | 0 |  |  |
| 8.762864296581668 | 0 |  |  |
| 8.76286429658167 | 0 |  |  |
| 8.76286429658167 | 0 |  |  |
| 8.762864296581673 | 0 |  |  |
| 8.762864296581675 | 0 |  |  |
| 8.762864296581675 | 0 |  |  |
| 8.762864296581679 | 0 |  |  |
| 8.76286429658168 | 0 |  |  |
| 8.76286429658168 | 0 |  |  |
| 8.762864296581684 | 0 |  |  |
| 8.762864296581686 | 0 |  |  |
| 8.762864296581688 | 0 |  |  |
| 8.76286429658169 | 0 |  |  |
| 8.76286429658169 | 0 |  |  |
| 8.76286429658169 | 0 |  |  |
| 8.762864296581695 | 0 |  |  |
| 8.762864296581697 | 0 |  |  |
| 8.762864296581698 | 0 |  |  |
| 8.7628642965817 | 0 |  |  |
| 8.7628642965817 | 0 |  |  |
| 8.762864296581704 | 0 |  |  |
| 8.762864296581705 | 0 |  |  |
| 8.762864296581707 | 0 |  |  |
| 8.762864296581707 | 0 |  |  |
| 8.76286429658171 | 0 |  |  |
| 8.76286429658171 | 0 |  |  |
| 8.762864296581714 | 0 |  |  |
| 8.762864296581714 | 0 |  |  |
| 8.762864296581718 | 0 |  |  |
| 8.76286429658172 | 0 |  |  |
| 8.76286429658172 | 0 |  |  |
| 8.762864296581723 | 0 |  |  |
| 8.762864296581723 | 0 |  |  |
| 8.762864296581727 | 0 |  |  |
| 8.762864296581728 | 0 |  |  |
| 8.76286429658173 | 0 |  |  |
| 8.76286429658173 | 0 |  |  |
| 8.762864296581734 | 0 |  |  |
| 8.762864296581736 | 0 |  |  |
| 8.762864296581737 | 0 |  |  |
| 8.76286429658174 | 0 |  |  |
| 8.76286429658174 | 0 |  |  |
| 8.76286429658174 | 0 |  |  |
| 8.762864296581744 | 0 |  |  |
| 8.762864296581746 | 0 |  |  |
| 8.762864296581746 | 0 |  |  |
| 8.76286429658175 | 0 |  |  |
| 8.76286429658175 | 0 |  |  |
| 8.762864296581753 | 0 |  |  |
| 8.762864296581755 | 0 |  |  |
| 8.762864296581755 | 0 |  |  |
| 8.762864296581759 | 0 |  |  |
| 8.76286429658176 | 0 |  |  |
| 8.76286429658176 | 0 |  |  |
| 8.762864296581762 | 0 |  |  |
| 8.762864296581766 | 0 |  |  |
| 8.762864296581768 | 0 |  |  |
| 8.76286429658177 | 0 |  |  |
| 8.76286429658177 | 0 |  |  |
| 8.762864296581771 | 0 |  |  |
| 8.762864296581775 | 0 |  |  |
| 8.762864296581776 | 0 |  |  |
| 8.762864296581778 | 0 |  |  |
| 8.76286429658178 | 0 |  |  |
| 8.76286429658178 | 0 |  |  |
| 8.762864296581784 | 0 |  |  |
| 8.762864296581785 | 0 |  |  |
| 8.762864296581787 | 0 |  |  |
| 8.762864296581787 | 0 |  |  |
| 8.76286429658179 | 0 |  |  |
| 8.76286429658179 | 0 |  |  |
| 8.762864296581794 | 0 |  |  |
| 8.762864296581794 | 0 |  |  |
| 8.762864296581798 | 0 |  |  |
| 8.7628642965818 | 0 |  |  |
| 8.7628642965818 | 0 |  |  |
| 8.762864296581803 | 0 |  |  |
| 8.762864296581805 | 0 |  |  |
| 8.762864296581807 | 0 |  |  |
| 8.762864296581808 | 0 |  |  |
| 8.76286429658181 | 0 |  |  |
| 8.76286429658181 | 0 |  |  |
| 8.762864296581814 | 0 |  |  |
| 8.762864296581816 | 0 |  |  |
| 8.762864296581817 | 0 |  |  |
| 8.76286429658182 | 0 |  |  |
| 8.76286429658182 | 0 |  |  |
| 8.762864296581823 | 0 |  |  |
| 8.762864296581824 | 0 |  |  |
| 8.762864296581826 | 0 |  |  |
| 8.762864296581826 | 0 |  |  |
| 8.76286429658183 | 0 |  |  |
| 8.76286429658183 | 0 |  |  |
| 8.762864296581833 | 0 |  |  |
| 8.762864296581833 | 0 |  |  |
| 8.762864296581837 | 0 |  |  |
| 8.762864296581839 | 0 |  |  |
| 8.76286429658184 | 0 |  |  |
| 8.76286429658184 | 0 |  |  |
| 8.762864296581842 | 0 |  |  |
| 8.762864296581846 | 0 |  |  |
| 8.762864296581848 | 0 |  |  |
| 8.76286429658185 | 0 |  |  |
| 8.76286429658185 | 0 |  |  |
| 8.762864296581853 | 0 |  |  |
| 8.762864296581855 | 0 |  |  |
| 8.762864296581856 | 0 |  |  |
| 8.762864296581858 | 0 |  |  |
| 8.76286429658186 | 0 |  |  |
| 8.76286429658186 | 0 |  |  |
| 8.762864296581863 | 0 |  |  |
| 8.762864296581865 | 0 |  |  |
| 8.762864296581865 | 0 |  |  |
| 8.762864296581869 | 0 |  |  |
| 8.76286429658187 | 0 |  |  |
| 8.762864296581872 | 0 |  |  |
| 8.762864296581874 | 0 |  |  |
| 8.762864296581874 | 0 |  |  |
| 8.762864296581878 | 0 |  |  |
| 8.76286429658188 | 0 |  |  |
| 8.76286429658188 | 0 |  |  |
| 8.762864296581881 | 0 |  |  |
| 8.762864296581885 | 0 |  |  |
| 8.762864296581887 | 0 |  |  |
| 8.762864296581888 | 0 |  |  |
| 8.76286429658189 | 0 |  |  |
| 8.76286429658189 | 0 |  |  |
| 8.762864296581894 | 0 |  |  |
| 8.762864296581895 | 0 |  |  |
| 8.762864296581897 | 0 |  |  |
| 8.762864296581897 | 0 |  |  |
| 8.7628642965819 | 0 |  |  |
| 8.7628642965819 | 0 |  |  |
| 8.762864296581904 | 0 |  |  |
| 8.762864296581906 | 0 |  |  |
| 8.762864296581906 | 0 |  |  |
| 8.76286429658191 | 0 |  |  |
| 8.76286429658191 | 0 |  |  |
| 8.76286429658191 | 0 |  |  |
| 8.762864296581913 | 0 |  |  |
| 8.762864296581917 | 0 |  |  |
| 8.762864296581919 | 0 |  |  |
| 8.76286429658192 | 0 |  |  |
| 8.76286429658192 | 0 |  |  |
| 8.762864296581922 | 0 |  |  |
| 8.762864296581926 | 0 |  |  |
| 8.762864296581927 | 0 |  |  |
| 8.76286429658193 | 0 |  |  |
| 8.76286429658193 | 0 |  |  |
| 8.76286429658193 | 0 |  |  |
| 8.762864296581935 | 0 |  |  |
| 8.762864296581936 | 0 |  |  |
| 8.762864296581938 | 0 |  |  |
| 8.76286429658194 | 0 |  |  |
| 8.76286429658194 | 0 |  |  |
| 8.76286429658194 | 0 |  |  |
| 8.762864296581945 | 0 |  |  |
| 8.762864296581945 | 0 |  |  |
| 8.762864296581949 | 0 |  |  |
| 8.76286429658195 | 0 |  |  |
| 8.76286429658195 | 0 |  |  |
| 8.762864296581954 | 0 |  |  |
| 8.762864296581956 | 0 |  |  |
| 8.762864296581958 | 0 |  |  |
| 8.76286429658196 | 0 |  |  |
| 8.76286429658196 | 0 |  |  |
| 8.76286429658196 | 0 |  |  |
| 8.762864296581965 | 0 |  |  |
| 8.762864296581967 | 0 |  |  |
| 8.762864296581968 | 0 |  |  |
| 8.76286429658197 | 0 |  |  |
| 8.76286429658197 | 0 |  |  |
| 8.762864296581974 | 0 |  |  |
| 8.762864296581975 | 0 |  |  |
| 8.762864296581977 | 0 |  |  |
| 8.762864296581977 | 0 |  |  |
| 8.76286429658198 | 0 |  |  |
| 8.76286429658198 | 0 |  |  |
| 8.762864296581984 | 0 |  |  |
| 8.762864296581984 | 0 |  |  |
| 8.762864296581988 | 0 |  |  |
| 8.76286429658199 | 0 |  |  |
| 8.76286429658199 | 0 |  |  |
| 8.76286429658199 | 0 |  |  |
| 8.762864296581993 | 0 |  |  |
| 8.762864296581997 | 0 |  |  |
| 8.762864296581999 | 0 |  |  |
| 8.762864296582 | 0 |  |  |
| 8.762864296582 | 0 |  |  |
| 8.762864296582004 | 0 |  |  |
| 8.762864296582006 | 0 |  |  |
| 8.762864296582007 | 0 |  |  |
| 8.76286429658201 | 0 |  |  |
| 8.76286429658201 | 0 |  |  |
| 8.76286429658201 | 0 |  |  |
| 8.762864296582014 | 0 |  |  |
| 8.762864296582016 | 0 |  |  |
| 8.762864296582016 | 0 |  |  |
| 8.76286429658202 | 0 |  |  |
| 8.76286429658202 | 0 |  |  |
| 8.762864296582023 | 0 |  |  |
| 8.762864296582025 | 0 |  |  |
| 8.762864296582025 | 0 |  |  |
| 8.762864296582029 | 0 |  |  |
| 8.76286429658203 | 0 |  |  |
| 8.76286429658203 | 0 |  |  |
| 8.762864296582032 | 0 |  |  |
| 8.762864296582036 | 0 |  |  |
| 8.762864296582038 | 0 |  |  |
| 8.76286429658204 | 0 |  |  |
| 8.76286429658204 | 0 |  |  |
| 8.76286429658204 | 0 |  |  |
| 8.762864296582045 | 0 |  |  |
| 8.762864296582046 | 0 |  |  |
| 8.762864296582048 | 0 |  |  |
| 8.76286429658205 | 0 |  |  |
| 8.76286429658205 | 0 |  |  |
| 8.762864296582054 | 0 |  |  |
| 8.762864296582055 | 0 |  |  |
| 8.762864296582057 | 0 |  |  |
| 8.762864296582057 | 0 |  |  |
| 8.76286429658206 | 0 |  |  |
| 8.76286429658206 | 0 |  |  |
| 8.762864296582064 | 0 |  |  |
| 8.762864296582064 | 0 |  |  |
| 8.762864296582068 | 0 |  |  |
| 8.76286429658207 | 0 |  |  |
| 8.76286429658207 | 0 |  |  |
| 8.762864296582073 | 0 |  |  |
| 8.762864296582075 | 0 |  |  |
| 8.762864296582077 | 0 |  |  |
| 8.762864296582078 | 0 |  |  |
| 8.76286429658208 | 0 |  |  |
| 8.76286429658208 | 0 |  |  |
| 8.762864296582084 | 0 |  |  |
| 8.762864296582086 | 0 |  |  |
| 8.762864296582087 | 0 |  |  |
| 8.76286429658209 | 0 |  |  |
| 8.76286429658209 | 0 |  |  |
| 8.76286429658209 | 0 |  |  |
| 8.762864296582094 | 0 |  |  |
| 8.762864296582096 | 0 |  |  |
| 8.762864296582096 | 0 |  |  |
| 8.7628642965821 | 0 |  |  |
| 8.7628642965821 | 0 |  |  |
| 8.762864296582103 | 0 |  |  |
| 8.762864296582105 | 0 |  |  |
| 8.762864296582107 | 0 |  |  |
| 8.762864296582109 | 0 |  |  |
| 8.76286429658211 | 0 |  |  |
| 8.76286429658211 | 0 |  |  |
| 8.762864296582112 | 0 |  |  |
| 8.762864296582116 | 0 |  |  |
| 8.762864296582118 | 0 |  |  |
| 8.76286429658212 | 0 |  |  |
| 8.76286429658212 | 0 |  |  |
| 8.762864296582123 | 0 |  |  |
| 8.762864296582125 | 0 |  |  |
| 8.762864296582126 | 0 |  |  |
| 8.762864296582128 | 0 |  |  |
| 8.76286429658213 | 0 |  |  |
| 8.76286429658213 | 0 |  |  |
| 8.762864296582134 | 0 |  |  |
| 8.762864296582135 | 0 |  |  |
| 8.762864296582135 | 0 |  |  |
| 8.762864296582139 | 0 |  |  |
| 8.76286429658214 | 0 |  |  |
| 8.76286429658214 | 0 |  |  |
| 8.762864296582144 | 0 |  |  |
| 8.762864296582144 | 0 |  |  |
| 8.762864296582148 | 0 |  |  |
| 8.76286429658215 | 0 |  |  |
| 8.76286429658215 | 0 |  |  |
| 8.762864296582151 | 0 |  |  |
| 8.762864296582155 | 0 |  |  |
| 8.762864296582157 | 0 |  |  |
| 8.762864296582158 | 0 |  |  |
| 8.76286429658216 | 0 |  |  |
| 8.76286429658216 | 0 |  |  |
| 8.762864296582164 | 0 |  |  |
| 8.762864296582165 | 0 |  |  |
| 8.762864296582167 | 0 |  |  |
| 8.762864296582167 | 0 |  |  |
| 8.76286429658217 | 0 |  |  |
| 8.762864296582173 | 0 |  |  |
| 8.762864296582174 | 0 |  |  |
| 8.762864296582176 | 0 |  |  |
| 8.762864296582176 | 0 |  |  |
| 8.76286429658218 | 0 |  |  |
| 8.76286429658218 | 0 |  |  |
| 8.762864296582183 | 0 |  |  |
| 8.762864296582183 | 0 |  |  |
| 8.762864296582187 | 0 |  |  |
| 8.762864296582189 | 0 |  |  |
| 8.76286429658219 | 0 |  |  |
| 8.76286429658219 | 0 |  |  |
| 8.762864296582192 | 0 |  |  |
| 8.762864296582196 | 0 |  |  |
| 8.762864296582197 | 0 |  |  |
| 8.7628642965822 | 0 |  |  |
| 8.7628642965822 | 0 |  |  |
| 8.7628642965822 | 0 |  |  |
| 8.762864296582205 | 0 |  |  |
| 8.762864296582206 | 0 |  |  |
| 8.762864296582208 | 0 |  |  |
| 8.76286429658221 | 0 |  |  |
| 8.76286429658221 | 0 |  |  |
| 8.76286429658221 | 0 |  |  |
| 8.762864296582215 | 0 |  |  |
| 8.762864296582215 | 0 |  |  |
| 8.762864296582219 | 0 |  |  |
| 8.76286429658222 | 0 |  |  |
| 8.76286429658222 | 0 |  |  |
| 8.762864296582224 | 0 |  |  |
| 8.762864296582226 | 0 |  |  |
| 8.762864296582228 | 0 |  |  |
| 8.76286429658223 | 0 |  |  |
| 8.76286429658223 | 0 |  |  |
| 8.76286429658223 | 0 |  |  |
| 8.762864296582235 | 0 |  |  |
| 8.762864296582237 | 0 |  |  |
| 8.762864296582238 | 0 |  |  |
| 8.76286429658224 | 0 |  |  |
| 8.76286429658224 | 0 |  |  |
| 8.76286429658224 | 0 |  |  |
| 8.762864296582245 | 0 |  |  |
| 8.762864296582247 | 0 |  |  |
| 8.762864296582247 | 0 |  |  |
| 8.76286429658225 | 0 |  |  |
| 8.76286429658225 | 0 |  |  |
| 8.762864296582254 | 0 |  |  |
| 8.762864296582254 | 0 |  |  |
| 8.762864296582258 | 0 |  |  |
| 8.76286429658226 | 0 |  |  |
| 8.76286429658226 | 0 |  |  |
| 8.76286429658226 | 0 |  |  |
| 8.762864296582263 | 0 |  |  |
| 8.762864296582267 | 0 |  |  |
| 8.762864296582269 | 0 |  |  |
| 8.76286429658227 | 0 |  |  |
| 8.76286429658227 | 0 |  |  |
| 8.762864296582274 | 0 |  |  |
| 8.762864296582276 | 0 |  |  |
| 8.762864296582277 | 0 |  |  |
| 8.76286429658228 | 0 |  |  |
| 8.76286429658228 | 0 |  |  |
| 8.76286429658228 | 0 |  |  |
| 8.762864296582284 | 0 |  |  |
| 8.762864296582286 | 0 |  |  |
| 8.762864296582286 | 0 |  |  |
| 8.76286429658229 | 0 |  |  |
| 8.76286429658229 | 0 |  |  |
| 8.76286429658229 | 0 |  |  |
| 8.762864296582295 | 0 |  |  |
| 8.762864296582295 | 0 |  |  |
| 8.762864296582299 | 0 |  |  |
| 8.7628642965823 | 0 |  |  |
| 8.7628642965823 | 0 |  |  |
| 8.762864296582302 | 0 |  |  |
| 8.762864296582306 | 0 |  |  |
| 8.762864296582308 | 0 |  |  |
| 8.76286429658231 | 0 |  |  |
| 8.76286429658231 | 0 |  |  |
| 8.76286429658231 | 0 |  |  |
| 8.762864296582315 | 0 |  |  |
| 8.762864296582316 | 0 |  |  |
| 8.762864296582318 | 0 |  |  |
| 8.76286429658232 | 0 |  |  |
| 8.76286429658232 | 0 |  |  |
| 8.762864296582324 | 0 |  |  |
| 8.762864296582325 | 0 |  |  |
| 8.762864296582327 | 0 |  |  |
| 8.762864296582327 | 0 |  |  |
| 8.76286429658233 | 0 |  |  |
| 8.76286429658233 | 0 |  |  |
| 8.762864296582334 | 0 |  |  |
| 8.762864296582334 | 0 |  |  |
| 8.762864296582338 | 0 |  |  |
| 8.76286429658234 | 0 |  |  |
| 8.76286429658234 | 0 |  |  |
| 8.76286429658234 | 0 |  |  |
| 8.762864296582343 | 0 |  |  |
| 8.762864296582347 | 0 |  |  |
| 8.762864296582348 | 0 |  |  |
| 8.76286429658235 | 0 |  |  |
| 8.76286429658235 | 0 |  |  |
| 8.762864296582354 | 0 |  |  |
| 8.762864296582356 | 0 |  |  |
| 8.762864296582357 | 0 |  |  |
| 8.76286429658236 | 0 |  |  |
| 8.76286429658236 | 0 |  |  |
| 8.76286429658236 | 0 |  |  |
| 8.762864296582364 | 0 |  |  |
| 8.762864296582366 | 0 |  |  |
| 8.762864296582366 | 0 |  |  |
| 8.76286429658237 | 0 |  |  |
| 8.76286429658237 | 0 |  |  |
| 8.762864296582373 | 0 |  |  |
| 8.762864296582375 | 0 |  |  |
| 8.762864296582377 | 0 |  |  |
| 8.762864296582379 | 0 |  |  |
| 8.76286429658238 | 0 |  |  |
| 8.76286429658238 | 0 |  |  |
| 8.762864296582382 | 0 |  |  |
| 8.762864296582386 | 0 |  |  |
| 8.762864296582388 | 0 |  |  |
| 8.76286429658239 | 0 |  |  |
| 8.76286429658239 | 0 |  |  |
| 8.76286429658239 | 0 |  |  |
| 8.762864296582395 | 0 |  |  |
| 8.762864296582396 | 0 |  |  |
| 8.762864296582398 | 0 |  |  |
| 8.7628642965824 | 0 |  |  |
| 8.7628642965824 | 0 |  |  |
| 8.762864296582404 | 0 |  |  |
| 8.762864296582405 | 0 |  |  |
| 8.762864296582405 | 0 |  |  |
| 8.762864296582409 | 0 |  |  |
| 8.76286429658241 | 0 |  |  |
| 8.76286429658241 | 0 |  |  |
| 8.762864296582414 | 0 |  |  |
| 8.762864296582414 | 0 |  |  |
| 8.762864296582418 | 0 |  |  |
| 8.76286429658242 | 0 |  |  |
| 8.76286429658242 | 0 |  |  |
| 8.762864296582421 | 0 |  |  |
| 8.762864296582425 | 0 |  |  |
| 8.762864296582427 | 0 |  |  |
| 8.762864296582428 | 0 |  |  |
| 8.76286429658243 | 0 |  |  |
| 8.76286429658243 | 0 |  |  |
| 8.762864296582434 | 0 |  |  |
| 8.762864296582435 | 0 |  |  |
| 8.762864296582437 | 0 |  |  |
| 8.762864296582437 | 0 |  |  |
| 8.76286429658244 | 0 |  |  |
| 8.76286429658244 | 0 |  |  |
| 8.762864296582444 | 0 |  |  |
| 8.762864296582446 | 0 |  |  |
| 8.762864296582446 | 0 |  |  |
| 8.76286429658245 | 0 |  |  |
| 8.76286429658245 | 0 |  |  |
| 8.762864296582453 | 0 |  |  |
| 8.762864296582453 | 0 |  |  |
| 8.762864296582457 | 0 |  |  |
| 8.762864296582459 | 0 |  |  |
| 8.76286429658246 | 0 |  |  |
| 8.76286429658246 | 0 |  |  |
| 8.762864296582462 | 0 |  |  |
| 8.762864296582466 | 0 |  |  |
| 8.762864296582467 | 0 |  |  |
| 8.76286429658247 | 0 |  |  |
| 8.76286429658247 | 0 |  |  |
| 8.762864296582473 | 0 |  |  |
| 8.762864296582475 | 0 |  |  |
| 8.762864296582476 | 0 |  |  |
| 8.762864296582478 | 0 |  |  |
| 8.76286429658248 | 0 |  |  |
| 8.76286429658248 | 0 |  |  |
| 8.762864296582483 | 0 |  |  |
| 8.762864296582485 | 0 |  |  |
| 8.762864296582485 | 0 |  |  |
| 8.762864296582489 | 0 |  |  |
| 8.76286429658249 | 0 |  |  |
| 8.76286429658249 | 0 |  |  |
| 8.762864296582494 | 0 |  |  |
| 8.762864296582496 | 0 |  |  |
| 8.762864296582498 | 0 |  |  |
| 8.7628642965825 | 0 |  |  |
| 8.7628642965825 | 0 |  |  |
| 8.762864296582501 | 0 |  |  |
| 8.762864296582505 | 0 |  |  |
| 8.762864296582507 | 0 |  |  |
| 8.762864296582508 | 0 |  |  |
| 8.76286429658251 | 0 |  |  |
| 8.76286429658251 | 0 |  |  |
| 8.762864296582514 | 0 |  |  |
| 8.762864296582515 | 0 |  |  |
| 8.762864296582517 | 0 |  |  |
| 8.762864296582517 | 0 |  |  |
| 8.76286429658252 | 0 |  |  |
| 8.762864296582523 | 0 |  |  |
| 8.762864296582524 | 0 |  |  |
| 8.762864296582526 | 0 |  |  |
| 8.762864296582528 | 0 |  |  |
| 8.76286429658253 | 0 |  |  |
| 8.76286429658253 | 0 |  |  |
| 8.762864296582533 | 0 |  |  |
| 8.762864296582533 | 0 |  |  |
| 8.762864296582537 | 0 |  |  |
| 8.762864296582539 | 0 |  |  |
| 8.76286429658254 | 0 |  |  |
| 8.76286429658254 | 0 |  |  |
| 8.762864296582544 | 0 |  |  |
| 8.762864296582546 | 0 |  |  |
| 8.762864296582547 | 0 |  |  |
| 8.76286429658255 | 0 |  |  |
| 8.76286429658255 | 0 |  |  |
| 8.762864296582553 | 0 |  |  |
| 8.762864296582555 | 0 |  |  |
| 8.762864296582556 | 0 |  |  |
| 8.762864296582556 | 0 |  |  |
| 8.76286429658256 | 0 |  |  |
| 8.76286429658256 | 0 |  |  |
| 8.762864296582563 | 0 |  |  |
| 8.762864296582565 | 0 |  |  |
| 8.762864296582565 | 0 |  |  |
| 8.762864296582569 | 0 |  |  |
| 8.76286429658257 | 0 |  |  |
| 8.762864296582572 | 0 |  |  |
| 8.762864296582572 | 0 |  |  |
| 8.762864296582576 | 0 |  |  |
| 8.762864296582578 | 0 |  |  |
| 8.76286429658258 | 0 |  |  |
| 8.76286429658258 | 0 |  |  |
| 8.762864296582581 | 0 |  |  |
| 8.762864296582585 | 0 |  |  |
| 8.762864296582586 | 0 |  |  |
| 8.762864296582588 | 0 |  |  |
| 8.76286429658259 | 0 |  |  |
| 8.76286429658259 | 0 |  |  |
| 8.762864296582594 | 0 |  |  |
| 8.762864296582595 | 0 |  |  |
| 8.762864296582597 | 0 |  |  |
| 8.762864296582597 | 0 |  |  |
| 8.7628642965826 | 0 |  |  |
| 8.7628642965826 | 0 |  |  |
| 8.762864296582604 | 0 |  |  |
| 8.762864296582604 | 0 |  |  |
| 8.762864296582608 | 0 |  |  |
| 8.76286429658261 | 0 |  |  |
| 8.76286429658261 | 0 |  |  |
| 8.76286429658261 | 0 |  |  |
| 8.762864296582613 | 0 |  |  |
| 8.762864296582617 | 0 |  |  |
| 8.762864296582618 | 0 |  |  |
| 8.76286429658262 | 0 |  |  |
| 8.76286429658262 | 0 |  |  |
| 8.762864296582624 | 0 |  |  |
| 8.762864296582626 | 0 |  |  |
| 8.762864296582627 | 0 |  |  |
| 8.76286429658263 | 0 |  |  |
| 8.76286429658263 | 0 |  |  |
| 8.76286429658263 | 0 |  |  |
| 8.762864296582634 | 0 |  |  |
| 8.762864296582636 | 0 |  |  |
| 8.762864296582636 | 0 |  |  |
| 8.76286429658264 | 0 |  |  |
| 8.76286429658264 | 0 |  |  |
| 8.76286429658264 | 0 |  |  |
| 8.762864296582645 | 0 |  |  |
| 8.762864296582647 | 0 |  |  |
| 8.762864296582649 | 0 |  |  |
| 8.76286429658265 | 0 |  |  |
| 8.76286429658265 | 0 |  |  |
| 8.762864296582652 | 0 |  |  |
| 8.762864296582656 | 0 |  |  |
| 8.762864296582658 | 0 |  |  |
| 8.76286429658266 | 0 |  |  |
| 8.76286429658266 | 0 |  |  |
| 8.76286429658266 | 0 |  |  |
| 8.762864296582665 | 0 |  |  |
| 8.762864296582666 | 0 |  |  |
| 8.762864296582668 | 0 |  |  |
| 8.76286429658267 | 0 |  |  |
| 8.76286429658267 | 0 |  |  |
| 8.762864296582674 | 0 |  |  |
| 8.762864296582675 | 0 |  |  |
| 8.762864296582675 | 0 |  |  |
| 8.762864296582679 | 0 |  |  |
| 8.76286429658268 | 0 |  |  |
| 8.76286429658268 | 0 |  |  |
| 8.762864296582684 | 0 |  |  |
| 8.762864296582684 | 0 |  |  |
| 8.762864296582688 | 0 |  |  |
| 8.76286429658269 | 0 |  |  |
| 8.76286429658269 | 0 |  |  |
| 8.76286429658269 | 0 |  |  |
| 8.762864296582695 | 0 |  |  |
| 8.762864296582697 | 0 |  |  |
| 8.762864296582698 | 0 |  |  |
| 8.7628642965827 | 0 |  |  |
| 8.7628642965827 | 0 |  |  |
| 8.762864296582704 | 0 |  |  |
| 8.762864296582705 | 0 |  |  |
| 8.762864296582707 | 0 |  |  |
| 8.762864296582707 | 0 |  |  |
| 8.76286429658271 | 0 |  |  |
| 8.76286429658271 | 0 |  |  |
| 8.762864296582714 | 0 |  |  |
| 8.762864296582716 | 0 |  |  |
| 8.762864296582716 | 0 |  |  |
| 8.76286429658272 | 0 |  |  |
| 8.76286429658272 | 0 |  |  |
| 8.762864296582723 | 0 |  |  |
| 8.762864296582723 | 0 |  |  |
| 8.762864296582727 | 0 |  |  |
| 8.762864296582729 | 0 |  |  |
| 8.76286429658273 | 0 |  |  |
| 8.76286429658273 | 0 |  |  |
| 8.762864296582732 | 0 |  |  |
| 8.762864296582736 | 0 |  |  |
| 8.762864296582737 | 0 |  |  |
| 8.76286429658274 | 0 |  |  |
| 8.76286429658274 | 0 |  |  |
| 8.76286429658274 | 0 |  |  |
| 8.762864296582745 | 0 |  |  |
| 8.762864296582746 | 0 |  |  |
| 8.762864296582748 | 0 |  |  |
| 8.76286429658275 | 0 |  |  |
| 8.76286429658275 | 0 |  |  |
| 8.762864296582753 | 0 |  |  |
| 8.762864296582755 | 0 |  |  |
| 8.762864296582755 | 0 |  |  |
| 8.762864296582759 | 0 |  |  |
| 8.76286429658276 | 0 |  |  |
| 8.76286429658276 | 0 |  |  |
| 8.762864296582764 | 0 |  |  |
| 8.762864296582764 | 0 |  |  |
| 8.762864296582768 | 0 |  |  |
| 8.76286429658277 | 0 |  |  |
| 8.76286429658277 | 0 |  |  |
| 8.762864296582771 | 0 |  |  |
| 8.762864296582775 | 0 |  |  |
| 8.762864296582777 | 0 |  |  |
| 8.762864296582778 | 0 |  |  |
| 8.76286429658278 | 0 |  |  |
| 8.76286429658278 | 0 |  |  |
| 8.762864296582784 | 0 |  |  |
| 8.762864296582785 | 0 |  |  |
| 8.762864296582787 | 0 |  |  |
| 8.762864296582787 | 0 |  |  |
| 8.76286429658279 | 0 |  |  |
| 8.76286429658279 | 0 |  |  |
| 8.762864296582794 | 0 |  |  |
| 8.762864296582796 | 0 |  |  |
| 8.762864296582798 | 0 |  |  |
| 8.7628642965828 | 0 |  |  |
| 8.7628642965828 | 0 |  |  |
| 8.762864296582803 | 0 |  |  |
| 8.762864296582803 | 0 |  |  |
| 8.762864296582807 | 0 |  |  |
| 8.762864296582809 | 0 |  |  |
| 8.76286429658281 | 0 |  |  |
| 8.76286429658281 | 0 |  |  |
| 8.762864296582814 | 0 |  |  |
| 8.762864296582816 | 0 |  |  |
| 8.762864296582817 | 0 |  |  |
| 8.76286429658282 | 0 |  |  |
| 8.76286429658282 | 0 |  |  |
| 8.762864296582823 | 0 |  |  |
| 8.762864296582825 | 0 |  |  |
| 8.762864296582826 | 0 |  |  |
| 8.762864296582826 | 0 |  |  |
| 8.76286429658283 | 0 |  |  |
| 8.76286429658283 | 0 |  |  |
| 8.762864296582833 | 0 |  |  |
| 8.762864296582835 | 0 |  |  |
| 8.762864296582835 | 0 |  |  |
| 8.762864296582839 | 0 |  |  |
| 8.76286429658284 | 0 |  |  |
| 8.76286429658284 | 0 |  |  |
| 8.762864296582842 | 0 |  |  |
| 8.762864296582846 | 0 |  |  |
| 8.762864296582848 | 0 |  |  |
| 8.76286429658285 | 0 |  |  |
| 8.76286429658285 | 0 |  |  |
| 8.762864296582851 | 0 |  |  |
| 8.762864296582855 | 0 |  |  |
| 8.762864296582856 | 0 |  |  |
| 8.762864296582858 | 0 |  |  |
| 8.76286429658286 | 0 |  |  |
| 8.76286429658286 | 0 |  |  |
| 8.762864296582864 | 0 |  |  |
| 8.762864296582865 | 0 |  |  |
| 8.762864296582867 | 0 |  |  |
| 8.762864296582867 | 0 |  |  |
| 8.76286429658287 | 0 |  |  |
| 8.762864296582872 | 0 |  |  |
| 8.762864296582874 | 0 |  |  |
| 8.762864296582874 | 0 |  |  |
| 8.762864296582878 | 0 |  |  |
| 8.76286429658288 | 0 |  |  |
| 8.76286429658288 | 0 |  |  |
| 8.762864296582883 | 0 |  |  |
| 8.762864296582883 | 0 |  |  |
| 8.762864296582887 | 0 |  |  |
| 8.762864296582888 | 0 |  |  |
| 8.76286429658289 | 0 |  |  |
| 8.76286429658289 | 0 |  |  |
| 8.762864296582894 | 0 |  |  |
| 8.762864296582896 | 0 |  |  |
| 8.762864296582897 | 0 |  |  |
| 8.7628642965829 | 0 |  |  |
| 8.7628642965829 | 0 |  |  |
| 8.7628642965829 | 0 |  |  |
| 8.762864296582904 | 0 |  |  |
| 8.762864296582906 | 0 |  |  |
| 8.762864296582906 | 0 |  |  |
| 8.76286429658291 | 0 |  |  |
| 8.76286429658291 | 0 |  |  |
| 8.76286429658291 | 0 |  |  |
| 8.762864296582915 | 0 |  |  |
| 8.762864296582917 | 0 |  |  |
| 8.762864296582919 | 0 |  |  |
| 8.76286429658292 | 0 |  |  |
| 8.76286429658292 | 0 |  |  |
| 8.762864296582922 | 0 |  |  |
| 8.762864296582926 | 0 |  |  |
| 8.762864296582928 | 0 |  |  |
| 8.76286429658293 | 0 |  |  |
| 8.76286429658293 | 0 |  |  |
| 8.76286429658293 | 0 |  |  |
| 8.762864296582935 | 0 |  |  |
| 8.762864296582936 | 0 |  |  |
| 8.762864296582938 | 0 |  |  |
| 8.76286429658294 | 0 |  |  |
| 8.76286429658294 | 0 |  |  |
| 8.76286429658294 | 0 |  |  |
| 8.762864296582945 | 0 |  |  |
| 8.762864296582945 | 0 |  |  |
| 8.762864296582949 | 0 |  |  |
| 8.76286429658295 | 0 |  |  |
| 8.76286429658295 | 0 |  |  |
| 8.762864296582954 | 0 |  |  |
| 8.762864296582954 | 0 |  |  |
| 8.762864296582958 | 0 |  |  |
| 8.76286429658296 | 0 |  |  |
| 8.76286429658296 | 0 |  |  |
| 8.76286429658296 | 0 |  |  |
| 8.762864296582965 | 0 |  |  |
| 8.762864296582967 | 0 |  |  |
| 8.762864296582968 | 0 |  |  |
| 8.76286429658297 | 0 |  |  |
| 8.76286429658297 | 0 |  |  |
| 8.762864296582974 | 0 |  |  |
| 8.762864296582975 | 0 |  |  |
| 8.762864296582977 | 0 |  |  |
| 8.762864296582977 | 0 |  |  |
| 8.76286429658298 | 0 |  |  |
| 8.76286429658298 | 0 |  |  |
| 8.762864296582984 | 0 |  |  |
| 8.762864296582986 | 0 |  |  |
| 8.762864296582986 | 0 |  |  |
| 8.76286429658299 | 0 |  |  |
| 8.76286429658299 | 0 |  |  |
| 8.76286429658299 | 0 |  |  |
| 8.762864296582993 | 0 |  |  |
| 8.762864296582997 | 0 |  |  |
| 8.762864296582999 | 0 |  |  |
| 8.762864296583 | 0 |  |  |
| 8.762864296583 | 0 |  |  |
| 8.762864296583002 | 0 |  |  |
| 8.762864296583006 | 0 |  |  |
| 8.762864296583007 | 0 |  |  |
| 8.76286429658301 | 0 |  |  |
| 8.76286429658301 | 0 |  |  |
| 8.76286429658301 | 0 |  |  |
| 8.762864296583015 | 0 |  |  |
| 8.762864296583016 | 0 |  |  |
| 8.762864296583018 | 0 |  |  |
| 8.76286429658302 | 0 |  |  |
| 8.76286429658302 | 0 |  |  |
| 8.762864296583023 | 0 |  |  |
| 8.762864296583025 | 0 |  |  |
| 8.762864296583025 | 0 |  |  |
| 8.762864296583029 | 0 |  |  |
| 8.76286429658303 | 0 |  |  |
| 8.76286429658303 | 0 |  |  |
| 8.762864296583034 | 0 |  |  |
| 8.762864296583034 | 0 |  |  |
| 8.762864296583038 | 0 |  |  |
| 8.76286429658304 | 0 |  |  |
| 8.76286429658304 | 0 |  |  |
| 8.76286429658304 | 0 |  |  |
| 8.762864296583045 | 0 |  |  |
| 8.762864296583047 | 0 |  |  |
| 8.762864296583048 | 0 |  |  |
| 8.76286429658305 | 0 |  |  |
| 8.76286429658305 | 0 |  |  |
| 8.762864296583054 | 0 |  |  |
| 8.762864296583055 | 0 |  |  |
| 8.762864296583057 | 0 |  |  |
| 8.762864296583057 | 0 |  |  |
| 8.76286429658306 | 0 |  |  |
| 8.76286429658306 | 0 |  |  |
| 8.762864296583064 | 0 |  |  |
| 8.762864296583066 | 0 |  |  |
| 8.762864296583068 | 0 |  |  |
| 8.76286429658307 | 0 |  |  |
| 8.76286429658307 | 0 |  |  |
| 8.762864296583073 | 0 |  |  |
| 8.762864296583073 | 0 |  |  |
| 8.762864296583077 | 0 |  |  |
| 8.762864296583079 | 0 |  |  |
| 8.76286429658308 | 0 |  |  |
| 8.76286429658308 | 0 |  |  |
| 8.762864296583084 | 0 |  |  |
| 8.762864296583086 | 0 |  |  |
| 8.762864296583087 | 0 |  |  |
| 8.76286429658309 | 0 |  |  |
| 8.76286429658309 | 0 |  |  |
| 8.76286429658309 | 0 |  |  |
| 8.762864296583095 | 0 |  |  |
| 8.762864296583096 | 0 |  |  |
| 8.762864296583096 | 0 |  |  |
| 8.7628642965831 | 0 |  |  |
| 8.7628642965831 | 0 |  |  |
| 8.762864296583103 | 0 |  |  |
| 8.762864296583105 | 0 |  |  |
| 8.762864296583105 | 0 |  |  |
| 8.762864296583109 | 0 |  |  |
| 8.76286429658311 | 0 |  |  |
| 8.76286429658311 | 0 |  |  |
| 8.762864296583112 | 0 |  |  |
| 8.762864296583116 | 0 |  |  |
| 8.762864296583118 | 0 |  |  |
| 8.76286429658312 | 0 |  |  |
| 8.76286429658312 | 0 |  |  |
| 8.762864296583121 | 0 |  |  |
| 8.762864296583125 | 0 |  |  |
| 8.762864296583126 | 0 |  |  |
| 8.762864296583128 | 0 |  |  |
| 8.76286429658313 | 0 |  |  |
| 8.76286429658313 | 0 |  |  |
| 8.762864296583134 | 0 |  |  |
| 8.762864296583135 | 0 |  |  |
| 8.762864296583137 | 0 |  |  |
| 8.762864296583137 | 0 |  |  |
| 8.76286429658314 | 0 |  |  |
| 8.76286429658314 | 0 |  |  |
| 8.762864296583144 | 0 |  |  |
| 8.762864296583144 | 0 |  |  |
| 8.762864296583148 | 0 |  |  |
| 8.76286429658315 | 0 |  |  |
| 8.76286429658315 | 0 |  |  |
| 8.762864296583153 | 0 |  |  |
| 8.762864296583153 | 0 |  |  |
| 8.762864296583157 | 0 |  |  |
| 8.762864296583158 | 0 |  |  |
| 8.76286429658316 | 0 |  |  |
| 8.76286429658316 | 0 |  |  |
| 8.762864296583164 | 0 |  |  |
| 8.762864296583166 | 0 |  |  |
| 8.762864296583167 | 0 |  |  |
| 8.76286429658317 | 0 |  |  |
| 8.76286429658317 | 0 |  |  |
| 8.762864296583173 | 0 |  |  |
| 8.762864296583174 | 0 |  |  |
| 8.762864296583176 | 0 |  |  |
| 8.762864296583176 | 0 |  |  |
| 8.76286429658318 | 0 |  |  |
| 8.76286429658318 | 0 |  |  |
| 8.762864296583183 | 0 |  |  |
| 8.762864296583185 | 0 |  |  |
| 8.762864296583187 | 0 |  |  |
| 8.762864296583189 | 0 |  |  |
| 8.76286429658319 | 0 |  |  |
| 8.76286429658319 | 0 |  |  |
| 8.762864296583192 | 0 |  |  |
| 8.762864296583196 | 0 |  |  |
| 8.762864296583198 | 0 |  |  |
| 8.7628642965832 | 0 |  |  |
| 8.7628642965832 | 0 |  |  |
| 8.7628642965832 | 0 |  |  |
| 8.762864296583205 | 0 |  |  |
| 8.762864296583206 | 0 |  |  |
| 8.762864296583208 | 0 |  |  |
| 8.76286429658321 | 0 |  |  |
| 8.76286429658321 | 0 |  |  |
| 8.76286429658321 | 0 |  |  |
| 8.762864296583215 | 0 |  |  |
| 8.762864296583217 | 0 |  |  |
| 8.762864296583219 | 0 |  |  |
| 8.76286429658322 | 0 |  |  |
| 8.76286429658322 | 0 |  |  |
| 8.762864296583224 | 0 |  |  |
| 8.762864296583224 | 0 |  |  |
| 8.762864296583228 | 0 |  |  |
| 8.76286429658323 | 0 |  |  |
| 8.76286429658323 | 0 |  |  |
| 8.76286429658323 | 0 |  |  |
| 8.762864296583235 | 0 |  |  |
| 8.762864296583237 | 0 |  |  |
| 8.762864296583238 | 0 |  |  |
| 8.76286429658324 | 0 |  |  |
| 8.76286429658324 | 0 |  |  |
| 8.76286429658324 | 0 |  |  |
| 8.762864296583246 | 0 |  |  |
| 8.762864296583247 | 0 |  |  |
| 8.762864296583247 | 0 |  |  |
| 8.76286429658325 | 0 |  |  |
| 8.76286429658325 | 0 |  |  |
| 8.762864296583254 | 0 |  |  |
| 8.762864296583256 | 0 |  |  |
| 8.762864296583256 | 0 |  |  |
| 8.76286429658326 | 0 |  |  |
| 8.76286429658326 | 0 |  |  |
| 8.76286429658326 | 0 |  |  |
| 8.762864296583263 | 0 |  |  |
| 8.762864296583267 | 0 |  |  |
| 8.762864296583269 | 0 |  |  |
| 8.76286429658327 | 0 |  |  |
| 8.76286429658327 | 0 |  |  |
| 8.762864296583272 | 0 |  |  |
| 8.762864296583276 | 0 |  |  |
| 8.762864296583277 | 0 |  |  |
| 8.76286429658328 | 0 |  |  |
| 8.76286429658328 | 0 |  |  |
| 8.76286429658328 | 0 |  |  |
| 8.762864296583285 | 0 |  |  |
| 8.762864296583286 | 0 |  |  |
| 8.762864296583288 | 0 |  |  |
| 8.76286429658329 | 0 |  |  |
| 8.76286429658329 | 0 |  |  |
| 8.76286429658329 | 0 |  |  |
| 8.762864296583295 | 0 |  |  |
| 8.762864296583295 | 0 |  |  |
| 8.762864296583299 | 0 |  |  |
| 8.7628642965833 | 0 |  |  |
| 8.7628642965833 | 0 |  |  |
| 8.762864296583304 | 0 |  |  |
| 8.762864296583304 | 0 |  |  |
| 8.762864296583308 | 0 |  |  |
| 8.76286429658331 | 0 |  |  |
| 8.76286429658331 | 0 |  |  |
| 8.76286429658331 | 0 |  |  |
| 8.762864296583315 | 0 |  |  |
| 8.762864296583317 | 0 |  |  |
| 8.762864296583318 | 0 |  |  |
| 8.76286429658332 | 0 |  |  |
| 8.76286429658332 | 0 |  |  |
| 8.762864296583324 | 0 |  |  |
| 8.762864296583325 | 0 |  |  |
| 8.762864296583327 | 0 |  |  |
| 8.762864296583327 | 0 |  |  |
| 8.76286429658333 | 0 |  |  |
| 8.76286429658333 | 0 |  |  |
| 8.762864296583334 | 0 |  |  |
| 8.762864296583336 | 0 |  |  |
| 8.762864296583338 | 0 |  |  |
| 8.76286429658334 | 0 |  |  |
| 8.76286429658334 | 0 |  |  |
| 8.76286429658334 | 0 |  |  |
| 8.762864296583343 | 0 |  |  |
| 8.762864296583347 | 0 |  |  |
| 8.762864296583349 | 0 |  |  |
| 8.76286429658335 | 0 |  |  |
| 8.76286429658335 | 0 |  |  |
| 8.762864296583354 | 0 |  |  |
| 8.762864296583356 | 0 |  |  |
| 8.762864296583357 | 0 |  |  |
| 8.76286429658336 | 0 |  |  |
| 8.76286429658336 | 0 |  |  |
| 8.76286429658336 | 0 |  |  |
| 8.762864296583365 | 0 |  |  |
| 8.762864296583366 | 0 |  |  |
| 8.762864296583366 | 0 |  |  |
| 8.76286429658337 | 0 |  |  |
| 8.76286429658337 | 0 |  |  |
| 8.762864296583373 | 0 |  |  |
| 8.762864296583375 | 0 |  |  |
| 8.762864296583375 | 0 |  |  |
| 8.762864296583379 | 0 |  |  |
| 8.76286429658338 | 0 |  |  |
| 8.76286429658338 | 0 |  |  |
| 8.762864296583382 | 0 |  |  |
| 8.762864296583386 | 0 |  |  |
| 8.762864296583388 | 0 |  |  |
| 8.76286429658339 | 0 |  |  |
| 8.76286429658339 | 0 |  |  |
| 8.76286429658339 | 0 |  |  |
| 8.762864296583395 | 0 |  |  |
| 8.762864296583396 | 0 |  |  |
| 8.762864296583398 | 0 |  |  |
| 8.7628642965834 | 0 |  |  |
| 8.7628642965834 | 0 |  |  |
| 8.762864296583404 | 0 |  |  |
| 8.762864296583405 | 0 |  |  |
| 8.762864296583407 | 0 |  |  |
| 8.762864296583407 | 0 |  |  |
| 8.76286429658341 | 0 |  |  |
| 8.76286429658341 | 0 |  |  |
| 8.762864296583414 | 0 |  |  |
| 8.762864296583414 | 0 |  |  |
| 8.762864296583418 | 0 |  |  |
| 8.76286429658342 | 0 |  |  |
| 8.76286429658342 | 0 |  |  |
| 8.762864296583423 | 0 |  |  |
| 8.762864296583423 | 0 |  |  |
| 8.762864296583427 | 0 |  |  |
| 8.762864296583428 | 0 |  |  |
| 8.76286429658343 | 0 |  |  |
| 8.76286429658343 | 0 |  |  |
| 8.762864296583434 | 0 |  |  |
| 8.762864296583436 | 0 |  |  |
| 8.762864296583437 | 0 |  |  |
| 8.76286429658344 | 0 |  |  |
| 8.76286429658344 | 0 |  |  |
| 8.76286429658344 | 0 |  |  |
| 8.762864296583444 | 0 |  |  |
| 8.762864296583446 | 0 |  |  |
| 8.762864296583446 | 0 |  |  |
| 8.76286429658345 | 0 |  |  |
| 8.76286429658345 | 0 |  |  |
| 8.762864296583453 | 0 |  |  |
| 8.762864296583455 | 0 |  |  |
| 8.762864296583455 | 0 |  |  |
| 8.762864296583459 | 0 |  |  |
| 8.76286429658346 | 0 |  |  |
| 8.76286429658346 | 0 |  |  |
| 8.762864296583462 | 0 |  |  |
| 8.762864296583466 | 0 |  |  |
| 8.762864296583468 | 0 |  |  |
| 8.76286429658347 | 0 |  |  |
| 8.76286429658347 | 0 |  |  |
| 8.762864296583473 | 0 |  |  |
| 8.762864296583475 | 0 |  |  |
| 8.762864296583476 | 0 |  |  |
| 8.762864296583478 | 0 |  |  |
| 8.76286429658348 | 0 |  |  |
| 8.76286429658348 | 0 |  |  |
| 8.762864296583484 | 0 |  |  |
| 8.762864296583485 | 0 |  |  |
| 8.762864296583487 | 0 |  |  |
| 8.762864296583489 | 0 |  |  |
| 8.76286429658349 | 0 |  |  |
| 8.76286429658349 | 0 |  |  |
| 8.762864296583494 | 0 |  |  |
| 8.762864296583494 | 0 |  |  |
| 8.762864296583498 | 0 |  |  |
| 8.7628642965835 | 0 |  |  |
| 8.7628642965835 | 0 |  |  |
| 8.762864296583501 | 0 |  |  |
| 8.762864296583505 | 0 |  |  |
| 8.762864296583507 | 0 |  |  |
| 8.762864296583508 | 0 |  |  |
| 8.76286429658351 | 0 |  |  |
| 8.76286429658351 | 0 |  |  |
| 8.762864296583514 | 0 |  |  |
| 8.762864296583516 | 0 |  |  |
| 8.762864296583517 | 0 |  |  |
| 8.762864296583517 | 0 |  |  |
| 8.76286429658352 | 0 |  |  |
| 8.762864296583523 | 0 |  |  |
| 8.762864296583524 | 0 |  |  |
| 8.762864296583526 | 0 |  |  |
| 8.762864296583526 | 0 |  |  |
| 8.76286429658353 | 0 |  |  |
| 8.76286429658353 | 0 |  |  |
| 8.762864296583533 | 0 |  |  |
| 8.762864296583533 | 0 |  |  |
| 8.762864296583537 | 0 |  |  |
| 8.762864296583539 | 0 |  |  |
| 8.76286429658354 | 0 |  |  |
| 8.76286429658354 | 0 |  |  |
| 8.762864296583542 | 0 |  |  |
| 8.762864296583546 | 0 |  |  |
| 8.762864296583547 | 0 |  |  |
| 8.76286429658355 | 0 |  |  |
| 8.76286429658355 | 0 |  |  |
| 8.762864296583553 | 0 |  |  |